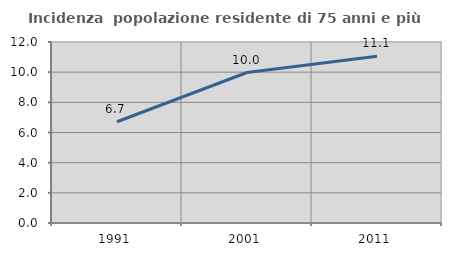
| Category | Incidenza  popolazione residente di 75 anni e più |
|---|---|
| 1991.0 | 6.712 |
| 2001.0 | 9.976 |
| 2011.0 | 11.051 |